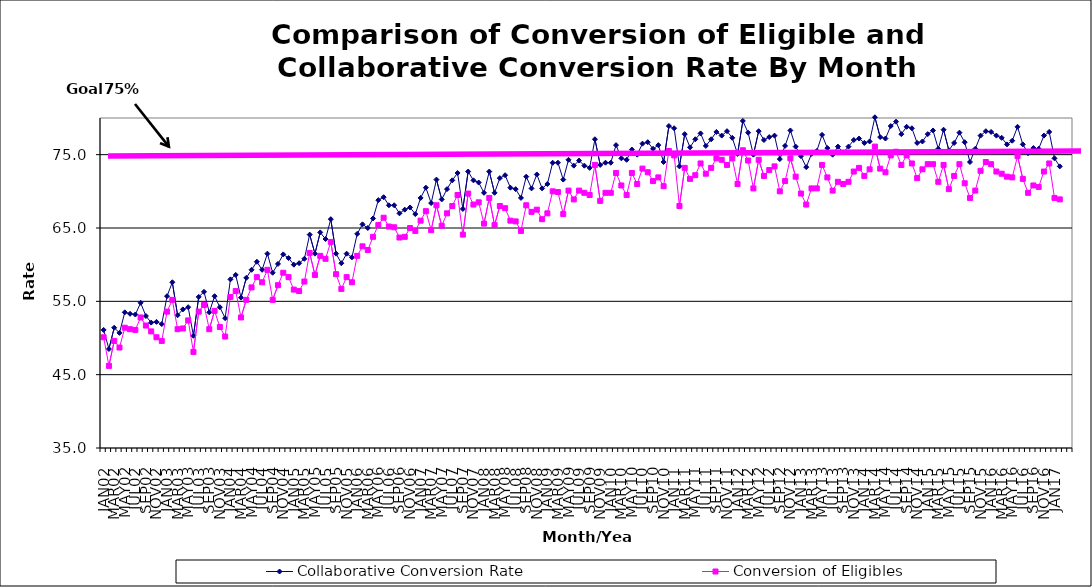
| Category | Collaborative Conversion Rate | Conversion of Eligibles |
|---|---|---|
| JAN02 | 51.1 | 50.1 |
| FEB02 | 48.5 | 46.2 |
| MAR02 | 51.4 | 49.6 |
| APR02 | 50.7 | 48.7 |
| MAY02 | 53.5 | 51.4 |
| JUN02 | 53.3 | 51.2 |
| JUL02 | 53.2 | 51.1 |
| AUG02 | 54.8 | 52.8 |
| SEP02 | 53 | 51.7 |
| OCT02 | 52.1 | 50.9 |
| NOV02 | 52.2 | 50.1 |
| DEC02 | 51.9 | 49.6 |
| JAN03 | 55.7 | 53.6 |
| FEB03 | 57.6 | 55.2 |
| MAR03 | 53.1 | 51.2 |
| APR03 | 53.9 | 51.3 |
| MAY03 | 54.2 | 52.4 |
| JUN03 | 50.3 | 48.1 |
| JUL03 | 55.6 | 53.6 |
| AUG03 | 56.3 | 54.5 |
| SEP03 | 53.5 | 51.2 |
| OCT03 | 55.7 | 53.7 |
| NOV03 | 54.2 | 51.5 |
| DEC03 | 52.7 | 50.2 |
| JAN04 | 58 | 55.6 |
| FEB04 | 58.6 | 56.4 |
| MAR04 | 55.5 | 52.8 |
| APR04 | 58.2 | 55.2 |
| MAY04 | 59.3 | 56.9 |
| JUN04 | 60.4 | 58.3 |
| JUL04 | 59.3 | 57.6 |
| AUG04 | 61.5 | 59.3 |
| SEP04 | 58.9 | 55.2 |
| OCT04 | 60.1 | 57.2 |
| NOV04 | 61.4 | 58.9 |
| DEC04 | 60.9 | 58.3 |
| JAN05 | 60 | 56.6 |
| FEB05 | 60.2 | 56.4 |
| MAR05 | 60.8 | 57.7 |
| APR05 | 64.1 | 61.6 |
| MAY05 | 61.5 | 58.6 |
| JUN05 | 64.4 | 61.2 |
| JUL05 | 63.5 | 60.8 |
| AUG05 | 66.2 | 63.1 |
| SEP05 | 61.5 | 58.7 |
| OCT05 | 60.2 | 56.7 |
| NOV05 | 61.5 | 58.3 |
| DEC05 | 61 | 57.6 |
| JAN06 | 64.2 | 61.2 |
| FEB06 | 65.5 | 62.5 |
| MAR06 | 65 | 62 |
| APR06 | 66.3 | 63.8 |
| MAY06 | 68.8 | 65.4 |
| JUN06 | 69.2 | 66.4 |
| JUL06 | 68.1 | 65.2 |
| AUG06 | 68.1 | 65.1 |
| SEP06 | 67 | 63.7 |
| OCT06 | 67.5 | 63.8 |
| NOV06 | 67.8 | 65 |
| DEC06 | 66.9 | 64.6 |
| JAN07 | 69.1 | 66 |
| FEB07 | 70.5 | 67.3 |
| MAR07 | 68.4 | 64.7 |
| APR07 | 71.6 | 68.1 |
| MAY07 | 68.9 | 65.3 |
| JUN07 | 70.3 | 67 |
| JUL07 | 71.5 | 68 |
| AUG07 | 72.5 | 69.5 |
| SEP07 | 67.6 | 64.1 |
| OCT07 | 72.7 | 69.7 |
| NOV07 | 71.5 | 68.2 |
| DEC07 | 71.2 | 68.5 |
| JAN08 | 69.8 | 65.6 |
| FEB08 | 72.7 | 69.1 |
| MAR08 | 69.8 | 65.4 |
| APR08 | 71.8 | 68 |
| MAY08 | 72.2 | 67.7 |
| JUN08 | 70.5 | 66 |
| JUL08 | 70.3 | 65.9 |
| AUG08 | 69.1 | 64.6 |
| SEP08 | 72 | 68.1 |
| OCT08 | 70.4 | 67.2 |
| NOV08 | 72.3 | 67.5 |
| DEC08 | 70.4 | 66.2 |
| JAN09 | 71 | 67 |
| FEB09 | 73.9 | 70 |
| MAR09 | 73.9 | 69.9 |
| APR09 | 71.6 | 66.9 |
| MAY09 | 74.3 | 70.1 |
| JUN09 | 73.5 | 68.9 |
| JUL09 | 74.2 | 70.1 |
| AUG09 | 73.5 | 69.8 |
| SEP09 | 73.2 | 69.5 |
| OCT09 | 77.1 | 73.6 |
| NOV09 | 73.6 | 68.7 |
| DEC09 | 73.9 | 69.8 |
| JAN10 | 73.9 | 69.8 |
| FEB10 | 76.3 | 72.5 |
| MAR10 | 74.5 | 70.8 |
| APR10 | 74.3 | 69.5 |
| MAY10 | 75.7 | 72.5 |
| JUN10 | 75 | 71 |
| JUL10 | 76.5 | 73.1 |
| AUG10 | 76.7 | 72.6 |
| SEP10 | 75.8 | 71.4 |
| OCT10 | 76.3 | 71.9 |
| NOV10 | 74 | 70.7 |
| DEC10 | 78.9 | 75.5 |
| JAN11 | 78.6 | 74.9 |
| FEB11 | 73.4 | 68 |
| MAR11 | 77.8 | 73.2 |
| APR11 | 76 | 71.7 |
| MAY11 | 77.1 | 72.2 |
| JUN11 | 77.9 | 73.8 |
| JUL11 | 76.2 | 72.4 |
| AUG11 | 77.1 | 73.2 |
| SEP11 | 78.1 | 74.5 |
| OCT11 | 77.6 | 74.3 |
| NOV11 | 78.2 | 73.6 |
| DEC11 | 77.3 | 74.5 |
| JAN12 | 75.1 | 71 |
| FEB12 | 79.6 | 75.6 |
| MAR12 | 78 | 74.2 |
| APR12 | 75 | 70.4 |
| MAY12 | 78.2 | 74.3 |
| JUN12 | 77 | 72.1 |
| JUL12 | 77.4 | 72.9 |
| AUG12 | 77.6 | 73.4 |
| SEP12 | 74.4 | 70 |
| OCT12 | 76.2 | 71.4 |
| NOV12 | 78.3 | 74.5 |
| DEC12 | 76.1 | 72 |
| JAN13 | 74.8 | 69.7 |
| FEB13 | 73.3 | 68.2 |
| MAR13 | 75.1 | 70.4 |
| APR13 | 75.5 | 70.4 |
| MAY13 | 77.7 | 73.6 |
| JUN13 | 75.9 | 71.9 |
| JUL13 | 75 | 70.1 |
| AUG13 | 76.1 | 71.3 |
| SEP13 | 75.3 | 71 |
| OCT13 | 76.1 | 71.3 |
| NOV13 | 77 | 72.7 |
| DEC13 | 77.2 | 73.2 |
| JAN14 | 76.6 | 72.1 |
| FEB14 | 76.8 | 73 |
| MAR14 | 80.1 | 76.1 |
| APR14 | 77.4 | 73.1 |
| MAY14 | 77.2 | 72.6 |
| JUN14 | 78.9 | 74.9 |
| JUL14 | 79.5 | 75.4 |
| AUG14 | 77.8 | 73.6 |
| SEP14 | 78.8 | 74.9 |
| OCT14 | 78.6 | 73.8 |
| NOV14 | 76.6 | 71.8 |
| DEC14 | 76.8 | 73 |
| JAN15 | 77.8 | 73.7 |
| FEB15 | 78.3 | 73.7 |
| MAR15 | 75.8 | 71.3 |
| APR15 | 78.4 | 73.6 |
| MAY15 | 75.6 | 70.3 |
| JUN15 | 76.6 | 72.1 |
| JUL15 | 78 | 73.7 |
| AUG15 | 76.7 | 71.1 |
| SEP15 | 74 | 69.1 |
| OCT15 | 75.8 | 70.1 |
| NOV15 | 77.6 | 72.8 |
| DEC15 | 78.2 | 74 |
| JAN16 | 78.1 | 73.7 |
| FEB16 | 77.6 | 72.7 |
| MAR16 | 77.3 | 72.4 |
| APR16 | 76.4 | 72 |
| MAY16 | 76.9 | 71.9 |
| JUN16 | 78.8 | 74.8 |
| JUL16 | 76.4 | 71.7 |
| AUG16 | 75.2 | 69.8 |
| SEP16 | 75.9 | 70.8 |
| OCT16 | 75.8 | 70.6 |
| NOV16 | 77.6 | 72.7 |
| DEC16 | 78.1 | 73.8 |
| JAN17 | 74.5 | 69.1 |
| FEB17 | 73.4 | 68.9 |